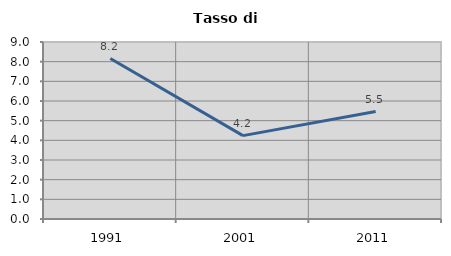
| Category | Tasso di disoccupazione   |
|---|---|
| 1991.0 | 8.159 |
| 2001.0 | 4.239 |
| 2011.0 | 5.464 |